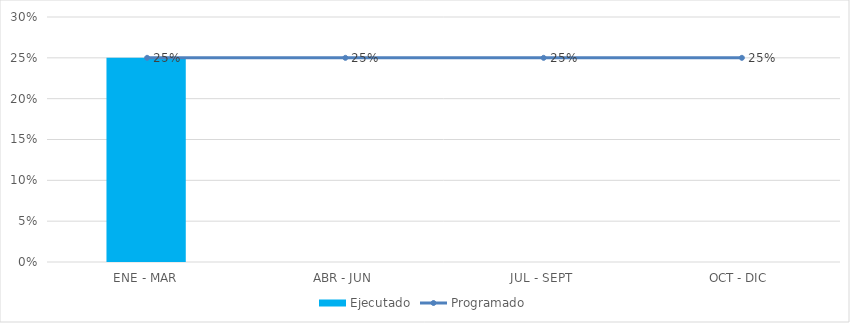
| Category | Ejecutado |
|---|---|
| ENE - MAR | 0.25 |
| ABR - JUN | 0 |
| JUL - SEPT | 0 |
| OCT - DIC | 0 |